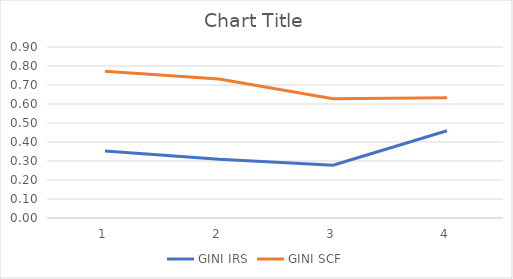
| Category | GINI IRS | GINI SCF |
|---|---|---|
| 0 | 0.352 | 0.773 |
| 1 | 0.309 | 0.731 |
| 2 | 0.278 | 0.628 |
| 3 | 0.459 | 0.633 |